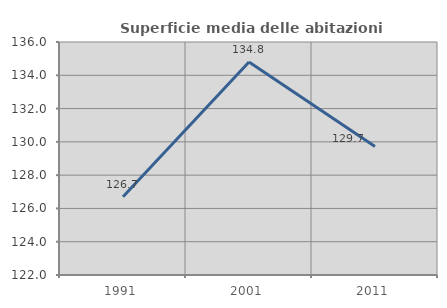
| Category | Superficie media delle abitazioni occupate |
|---|---|
| 1991.0 | 126.707 |
| 2001.0 | 134.796 |
| 2011.0 | 129.722 |